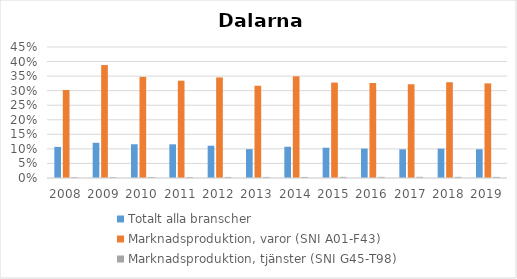
| Category | Totalt alla branscher | Marknadsproduktion, varor (SNI A01-F43) | Marknadsproduktion, tjänster (SNI G45-T98) |
|---|---|---|---|
| 2008 | 0.107 | 0.302 | 0.003 |
| 2009 | 0.121 | 0.388 | 0.003 |
| 2010 | 0.116 | 0.347 | 0.003 |
| 2011 | 0.116 | 0.334 | 0.003 |
| 2012 | 0.111 | 0.345 | 0.004 |
| 2013 | 0.099 | 0.317 | 0.004 |
| 2014 | 0.107 | 0.349 | 0.004 |
| 2015 | 0.104 | 0.328 | 0.004 |
| 2016 | 0.101 | 0.326 | 0.004 |
| 2017 | 0.099 | 0.322 | 0.004 |
| 2018 | 0.101 | 0.329 | 0.004 |
| 2019 | 0.099 | 0.325 | 0.004 |